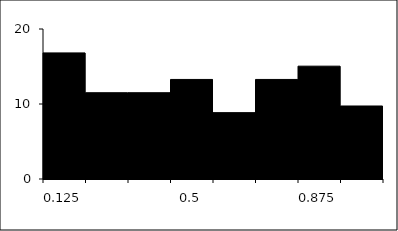
| Category | Series 1 |
|---|---|
| 0.125 | 16.814 |
| 0.25 | 11.504 |
| 0.375 | 11.504 |
| 0.5 | 13.274 |
| 0.625 | 8.85 |
| 0.75 | 13.274 |
| 0.875 | 15.044 |
| 1.0 | 9.735 |